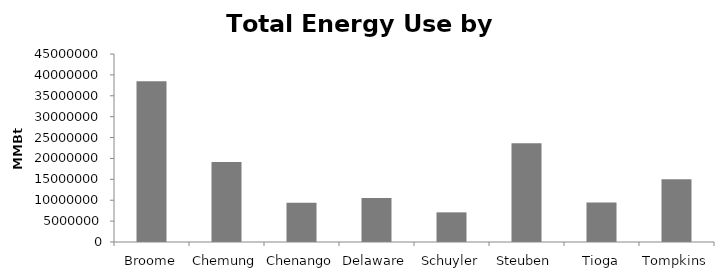
| Category | Total |
|---|---|
| Broome | 38484233.152 |
| Chemung | 19130549.057 |
| Chenango | 9402022.427 |
| Delaware | 10528055.855 |
| Schuyler | 7095171.376 |
| Steuben | 23627074.652 |
| Tioga | 9444825.77 |
| Tompkins | 15005957.87 |